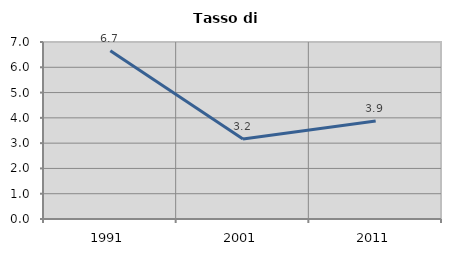
| Category | Tasso di disoccupazione   |
|---|---|
| 1991.0 | 6.658 |
| 2001.0 | 3.166 |
| 2011.0 | 3.872 |